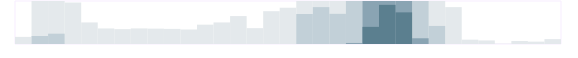
| Category | Логистика | Series 1 | Series 2 | Series 3 |
|---|---|---|---|---|
| 0.333333333333333 | 124 | 0 | 0 | 0 |
| nan | 750 | 140 | 0 | 0 |
| nan | 750 | 180 | 0 | 0 |
| nan | 723 | 0 | 0 | 0 |
| 0.416666666666667 | 376 | 0 | 0 | 0 |
| nan | 271 | 0 | 0 | 0 |
| nan | 259 | 0 | 0 | 0 |
| nan | 272 | 0 | 0 | 0 |
| 0.5 | 268 | 0 | 0 | 0 |
| nan | 263 | 0 | 0 | 0 |
| nan | 253 | 0 | 0 | 0 |
| nan | 337 | 0 | 0 | 0 |
| 0.583333333333333 | 376 | 0 | 0 | 0 |
| nan | 487 | 0 | 0 | 0 |
| nan | 276 | 0 | 0 | 0 |
| nan | 572 | 0 | 0 | 0 |
| 0.666666666666667 | 632 | 0 | 0 | 0 |
| nan | 750 | 523 | 0 | 0 |
| nan | 750 | 643 | 0 | 0 |
| nan | 750 | 526 | 0 | 0 |
| 0.75 | 750 | 750 | 18 | 0 |
| nan | 750 | 750 | 750 | 299 |
| nan | 750 | 750 | 750 | 683 |
| nan | 750 | 750 | 750 | 552 |
| 0.833333333333333 | 750 | 750 | 100 | 0 |
| nan | 750 | 315 | 0 | 0 |
| nan | 643 | 0 | 0 | 0 |
| nan | 75 | 0 | 0 | 0 |
| 0.916666666666667 | 62 | 0 | 0 | 0 |
| nan | 5 | 0 | 0 | 0 |
| nan | 52 | 0 | 0 | 0 |
| nan | 41 | 0 | 0 | 0 |
| 0.9993055555555556 | 85 | 0 | 0 | 0 |